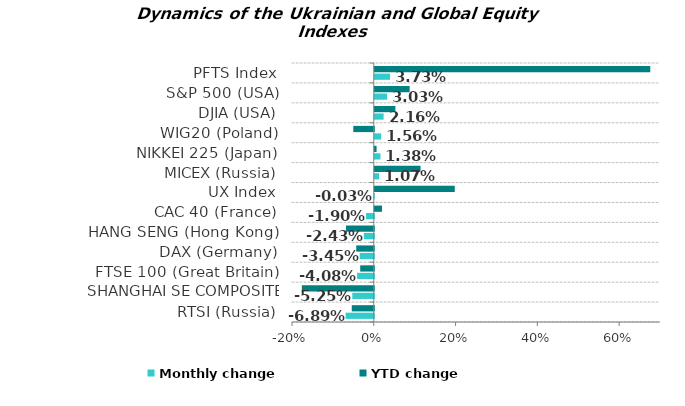
| Category | Monthly change | YTD change |
|---|---|---|
| RTSI (Russia) | -0.069 | -0.054 |
| SHANGHAI SE COMPOSITE (China) | -0.053 | -0.176 |
| FTSE 100 (Great Britain) | -0.041 | -0.033 |
| DAX (Germany) | -0.034 | -0.043 |
| HANG SENG (Hong Kong) | -0.024 | -0.068 |
| CAC 40 (France) | -0.019 | 0.018 |
| UX Index | 0 | 0.196 |
| MICEX (Russia) | 0.011 | 0.112 |
| NIKKEI 225 (Japan) | 0.014 | 0.004 |
| WIG20 (Poland) | 0.016 | -0.05 |
| DJIA (USA) | 0.022 | 0.05 |
| S&P 500 (USA) | 0.03 | 0.085 |
| PFTS Index | 0.037 | 0.674 |